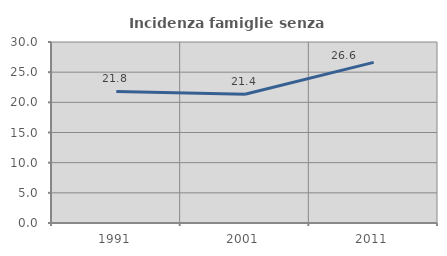
| Category | Incidenza famiglie senza nuclei |
|---|---|
| 1991.0 | 21.812 |
| 2001.0 | 21.352 |
| 2011.0 | 26.618 |